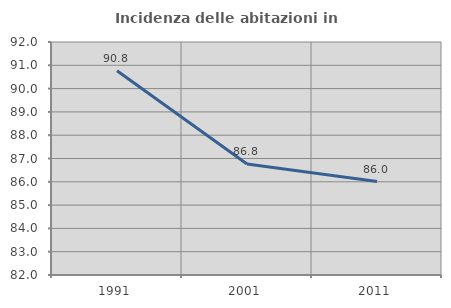
| Category | Incidenza delle abitazioni in proprietà  |
|---|---|
| 1991.0 | 90.769 |
| 2001.0 | 86.765 |
| 2011.0 | 86.01 |